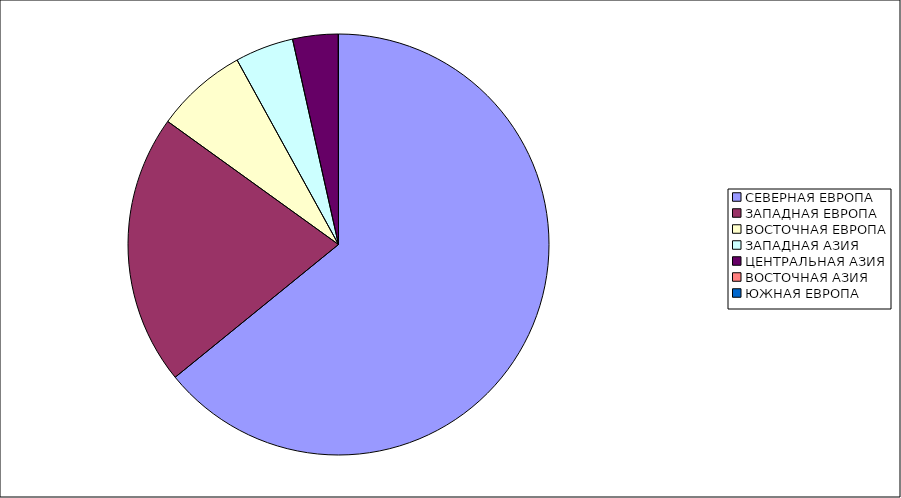
| Category | Оборот |
|---|---|
| СЕВЕРНАЯ ЕВРОПА | 64.136 |
| ЗАПАДНАЯ ЕВРОПА | 20.8 |
| ВОСТОЧНАЯ ЕВРОПА | 7.063 |
| ЗАПАДНАЯ АЗИЯ | 4.494 |
| ЦЕНТРАЛЬНАЯ АЗИЯ | 3.493 |
| ВОСТОЧНАЯ АЗИЯ | 0.012 |
| ЮЖНАЯ ЕВРОПА | 0.003 |